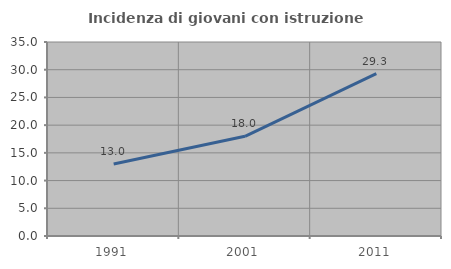
| Category | Incidenza di giovani con istruzione universitaria |
|---|---|
| 1991.0 | 12.996 |
| 2001.0 | 17.981 |
| 2011.0 | 29.283 |